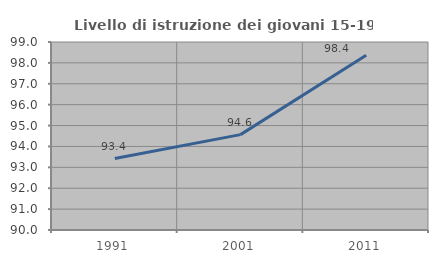
| Category | Livello di istruzione dei giovani 15-19 anni |
|---|---|
| 1991.0 | 93.421 |
| 2001.0 | 94.565 |
| 2011.0 | 98.361 |